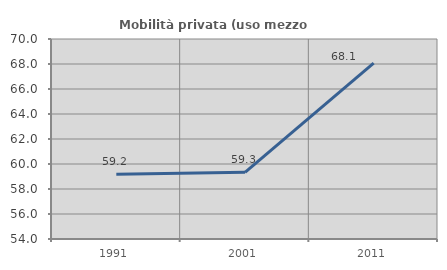
| Category | Mobilità privata (uso mezzo privato) |
|---|---|
| 1991.0 | 59.184 |
| 2001.0 | 59.331 |
| 2011.0 | 68.075 |